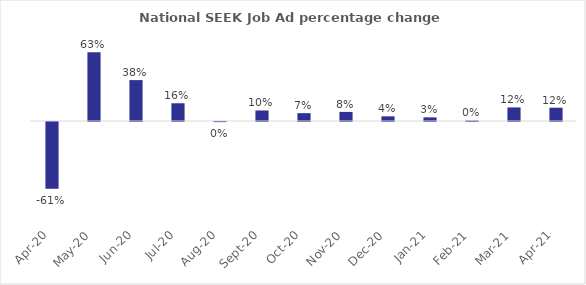
| Category | Series 0 |
|---|---|
| 2019-12-01 | 0.045 |
| 2020-01-01 | 0.045 |
| 2020-02-01 | -0.003 |
| 2020-03-01 | -0.261 |
| 2020-04-01 | -0.46 |
| 2020-05-01 | 0.39 |
| 2020-06-01 | 0.299 |
| 2020-07-01 | 0.071 |
| 2020-08-01 | 0.012 |
| 2020-09-01 | 0.066 |
| 2020-10-01 | 0.089 |
| 2020-11-01 | 0.087 |
| 2020-12-01 | 0.02 |